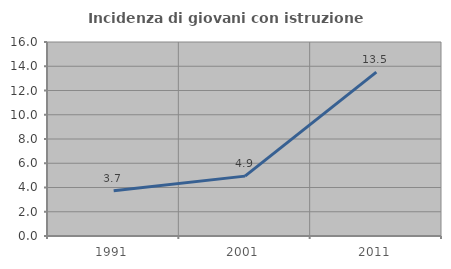
| Category | Incidenza di giovani con istruzione universitaria |
|---|---|
| 1991.0 | 3.738 |
| 2001.0 | 4.938 |
| 2011.0 | 13.514 |